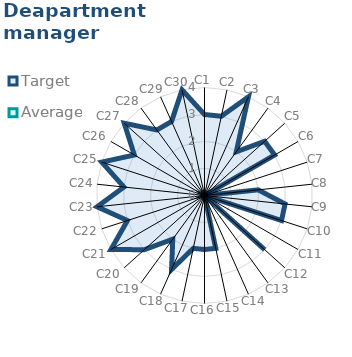
| Category | Target | Average |
|---|---|---|
| C1 | 3 | 0 |
| C2 | 3 | 0 |
| C3 | 4 | 0 |
| C4 | 2 | 0 |
| C5 | 3 | 0 |
| C6 | 3 | 0 |
| C7 | 0 | 0 |
| C8 | 2 | 0 |
| C9 | 3 | 0 |
| C10 | 3 | 0 |
| C11 | 0 | 0 |
| C12 | 3 | 0 |
| C13 | 0 | 0 |
| C14 | 0 | 0 |
| C15 | 2 | 0 |
| C16 | 2 | 0 |
| C17 | 2 | 0 |
| C18 | 3 | 0 |
| C19 | 2 | 0 |
| C20 | 3 | 0 |
| C21 | 4 | 0 |
| C22 | 3 | 0 |
| C23 | 4 | 0 |
| C24 | 3 | 0 |
| C25 | 4 | 0 |
| C26 | 3 | 0 |
| C27 | 4 | 0 |
| C28 | 3 | 0 |
| C29 | 3 | 0 |
| C30 | 4 | 0 |